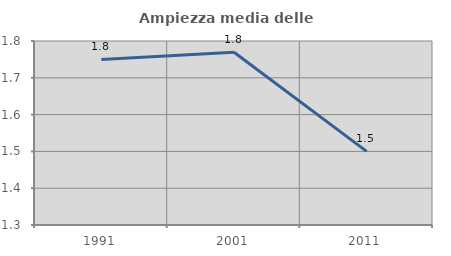
| Category | Ampiezza media delle famiglie |
|---|---|
| 1991.0 | 1.75 |
| 2001.0 | 1.769 |
| 2011.0 | 1.5 |